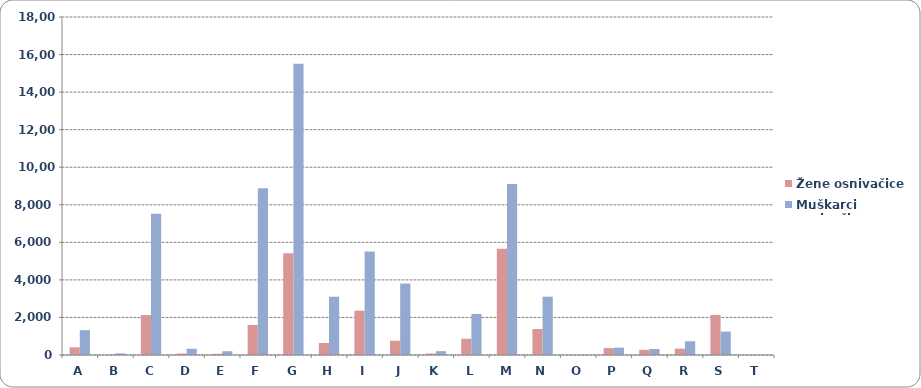
| Category | Žene osnivačice | Muškarci osnivači |
|---|---|---|
| A | 407 | 1324 |
| B | 17 | 86 |
| C | 2124 | 7527 |
| D | 79 | 332 |
| E | 59 | 201 |
| F | 1598 | 8879 |
| G | 5423 | 15504 |
| H | 640 | 3103 |
| I | 2361 | 5506 |
| J | 762 | 3805 |
| K | 78 | 204 |
| L | 867 | 2186 |
| M | 5658 | 9111 |
| N | 1382 | 3105 |
| O | 0 | 2 |
| P | 369 | 391 |
| Q | 272 | 319 |
| R | 337 | 734 |
| S | 2137 | 1246 |
| T | 2 | 0 |